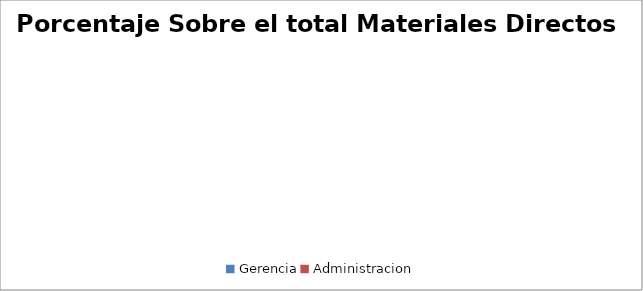
| Category | Porcentaje Sobre el total Materiales Directos |
|---|---|
| Gerencia | 0 |
| Administracion | 0 |